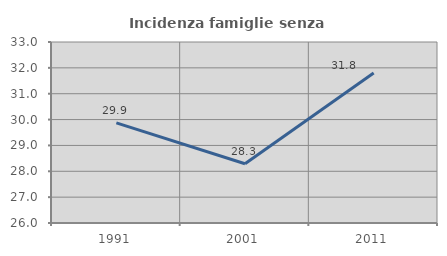
| Category | Incidenza famiglie senza nuclei |
|---|---|
| 1991.0 | 29.874 |
| 2001.0 | 28.293 |
| 2011.0 | 31.804 |